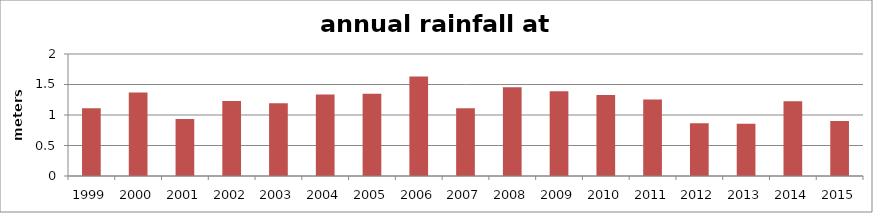
| Category | m precip |
|---|---|
| 1999.0 | 1.112 |
| 2000.0 | 1.37 |
| 2001.0 | 0.932 |
| 2002.0 | 1.23 |
| 2003.0 | 1.194 |
| 2004.0 | 1.334 |
| 2005.0 | 1.35 |
| 2006.0 | 1.631 |
| 2007.0 | 1.109 |
| 2008.0 | 1.456 |
| 2009.0 | 1.391 |
| 2010.0 | 1.329 |
| 2011.0 | 1.255 |
| 2012.0 | 0.864 |
| 2013.0 | 0.856 |
| 2014.0 | 1.224 |
| 2015.0 | 0.902 |